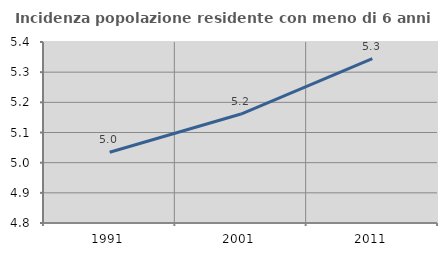
| Category | Incidenza popolazione residente con meno di 6 anni |
|---|---|
| 1991.0 | 5.034 |
| 2001.0 | 5.161 |
| 2011.0 | 5.345 |